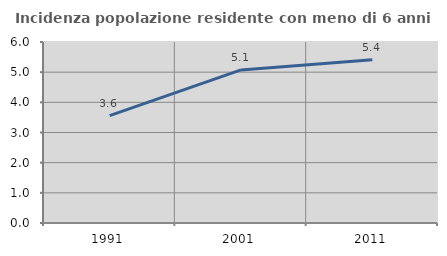
| Category | Incidenza popolazione residente con meno di 6 anni |
|---|---|
| 1991.0 | 3.559 |
| 2001.0 | 5.075 |
| 2011.0 | 5.409 |